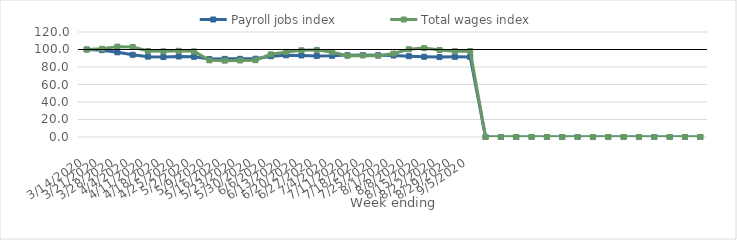
| Category | Payroll jobs index | Total wages index |
|---|---|---|
| 14/03/2020 | 100 | 100 |
| 21/03/2020 | 99.252 | 100.79 |
| 28/03/2020 | 96.77 | 103.281 |
| 04/04/2020 | 93.977 | 102.914 |
| 11/04/2020 | 91.842 | 98.303 |
| 18/04/2020 | 91.441 | 97.93 |
| 25/04/2020 | 92.029 | 98.484 |
| 02/05/2020 | 91.687 | 97.903 |
| 09/05/2020 | 89.19 | 87.638 |
| 16/05/2020 | 89.294 | 87.187 |
| 23/05/2020 | 89.351 | 87.437 |
| 30/05/2020 | 89.438 | 87.753 |
| 06/06/2020 | 92.356 | 94.498 |
| 13/06/2020 | 93.331 | 97.237 |
| 20/06/2020 | 93.2 | 99.074 |
| 27/06/2020 | 92.691 | 99.557 |
| 04/07/2020 | 92.824 | 96.78 |
| 11/07/2020 | 93.572 | 92.812 |
| 18/07/2020 | 93.712 | 93.199 |
| 25/07/2020 | 93.526 | 92.821 |
| 01/08/2020 | 93.137 | 95.355 |
| 08/08/2020 | 92.338 | 100.321 |
| 15/08/2020 | 91.717 | 101.57 |
| 22/08/2020 | 91.354 | 99.38 |
| 29/08/2020 | 91.631 | 98.104 |
| 05/09/2020 | 91.545 | 98.221 |